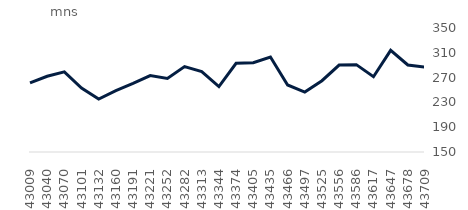
| Category | Full market |
|---|---|
| 2017-10-01 | 261477.022 |
| 2017-11-01 | 272184.065 |
| 2017-12-01 | 279282.391 |
| 2018-01-01 | 253044.752 |
| 2018-02-01 | 235454.628 |
| 2018-03-01 | 248828.408 |
| 2018-04-01 | 260604.372 |
| 2018-05-01 | 273229.01 |
| 2018-06-01 | 268729.63 |
| 2018-07-01 | 287772.647 |
| 2018-08-01 | 279835.407 |
| 2018-09-01 | 255584.804 |
| 2018-10-01 | 293120.053 |
| 2018-11-01 | 293983.564 |
| 2018-12-01 | 303168.59 |
| 2019-01-01 | 258151.509 |
| 2019-02-01 | 246599.826 |
| 2019-03-01 | 264976.976 |
| 2019-04-01 | 290253.873 |
| 2019-05-01 | 290891.074 |
| 2019-06-01 | 271390.044 |
| 2019-07-01 | 313961.3 |
| 2019-08-01 | 290350.19 |
| 2019-09-01 | 287043.904 |